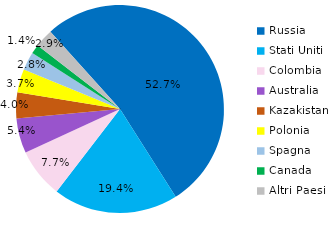
| Category | Series 0 |
|---|---|
| Russia | 4007.35 |
| Stati Uniti | 1477.537 |
| Colombia | 584.49 |
| Australia | 414.487 |
| Kazakistan | 304.277 |
| Polonia | 278.159 |
| Spagna | 214.83 |
| Canada | 109.134 |
| Altri Paesi | 217.395 |